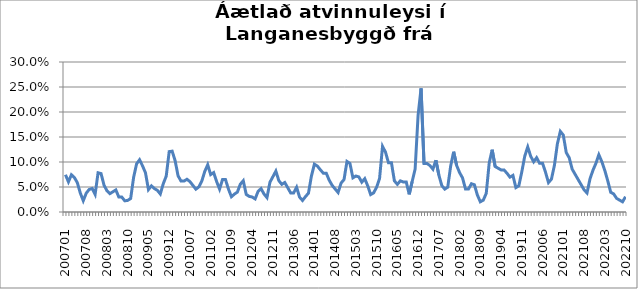
| Category | Series 0 |
|---|---|
| 200701 | 0.074 |
| 200702 | 0.06 |
| 200703 | 0.074 |
| 200704 | 0.069 |
| 200705 | 0.059 |
| 200706 | 0.038 |
| 200707 | 0.023 |
| 200708 | 0.038 |
| 200709 | 0.045 |
| 200710 | 0.047 |
| 200711 | 0.035 |
| 200712 | 0.078 |
| 200801 | 0.077 |
| 200802 | 0.054 |
| 200803 | 0.042 |
| 200804 | 0.037 |
| 200805 | 0.04 |
| 200806 | 0.044 |
| 200807 | 0.03 |
| 200808 | 0.03 |
| 200809 | 0.022 |
| 200810 | 0.023 |
| 200811 | 0.027 |
| 200812 | 0.069 |
| 200901 | 0.096 |
| 200902 | 0.104 |
| 200903 | 0.092 |
| 200904 | 0.078 |
| 200905 | 0.045 |
| 200906 | 0.052 |
| 200907 | 0.047 |
| 200908 | 0.043 |
| 200909 | 0.036 |
| 200910 | 0.057 |
| 200911 | 0.072 |
| 200912 | 0.121 |
| 201001 | 0.122 |
| 201002 | 0.103 |
| 201003 | 0.072 |
| 201004 | 0.062 |
| 201005 | 0.062 |
| 201006 | 0.065 |
| 201007 | 0.061 |
| 201008 | 0.053 |
| 201009 | 0.046 |
| 201010 | 0.05 |
| 201011 | 0.062 |
| 201012 | 0.081 |
| 201101 | 0.094 |
| 201102 | 0.075 |
| 201103 | 0.079 |
| 201104 | 0.061 |
| 201105 | 0.046 |
| 201106 | 0.065 |
| 201107 | 0.065 |
| 201108 | 0.046 |
| 201109 | 0.031 |
| 201110 | 0.036 |
| 201111 | 0.04 |
| 201112 | 0.056 |
| 201201 | 0.062 |
| 201202 | 0.035 |
| 201203 | 0.031 |
| 201204 | 0.03 |
| 201205 | 0.026 |
| 201206 | 0.041 |
| 201207 | 0.047 |
| 201208 | 0.036 |
| 201209 | 0.029 |
| 201210 | 0.059 |
| 201211 | 0.071 |
| 201212 | 0.082 |
| 201301 | 0.063 |
| 201302 | 0.055 |
| 201303 | 0.059 |
| 201304 | 0.049 |
| 201305 | 0.038 |
| 201306 | 0.038 |
| 201307 | 0.05 |
| 201308 | 0.03 |
| 201309 | 0.023 |
| 201310 | 0.031 |
| 201311 | 0.038 |
| 201312 | 0.072 |
| 201401 | 0.096 |
| 201402 | 0.092 |
| 201403 | 0.085 |
| 201404 | 0.078 |
| 201405 | 0.078 |
| 201406 | 0.064 |
| 201407 | 0.053 |
| 201408 | 0.046 |
| 201409 | 0.039 |
| 201410 | 0.058 |
| 201411 | 0.065 |
| 201412 | 0.101 |
| 201501 | 0.097 |
| 201502 | 0.068 |
| 201503 | 0.072 |
| 201504 | 0.07 |
| 201505 | 0.06 |
| 201506 | 0.067 |
| 201507 | 0.052 |
| 201508 | 0.035 |
| 201509 | 0.038 |
| 201510 | 0.05 |
| 201511 | 0.067 |
| 201512 | 0.131 |
| 201601 | 0.12 |
| 201602 | 0.099 |
| 201603 | 0.099 |
| 201604 | 0.062 |
| 201605 | 0.055 |
| 201606 | 0.062 |
| 201607 | 0.06 |
| 201608 | 0.06 |
| 201609 | 0.035 |
| 201610 | 0.061 |
| 201611 | 0.086 |
| 201612 | 0.194 |
| 201701 | 0.247 |
| 201702 | 0.097 |
| 201703 | 0.097 |
| 201704 | 0.093 |
| 201705 | 0.086 |
| 201706 | 0.104 |
| 201707 | 0.074 |
| 201708 | 0.053 |
| 201709 | 0.046 |
| 201710 | 0.05 |
| 201711 | 0.092 |
| 201712 | 0.121 |
| 201801 | 0.093 |
| 201802 | 0.079 |
| 201803 | 0.068 |
| 201804 | 0.046 |
| 201805 | 0.046 |
| 201806 | 0.057 |
| 201807 | 0.054 |
| 201808 | 0.034 |
| 201809 | 0.02 |
| 201810 | 0.024 |
| 201811 | 0.037 |
| 201812 | 0.098 |
| 201901 | 0.125 |
| 201902 | 0.091 |
| 201903 | 0.088 |
| 201904 | 0.084 |
| 201905 | 0.084 |
| 201906 | 0.077 |
| 201907 | 0.07 |
| 201908 | 0.073 |
| 201909 | 0.049 |
| 201910 | 0.052 |
| 201911 | 0.08 |
| 201912 | 0.112 |
| 202001 | 0.13 |
| 202002 | 0.112 |
| 202003 | 0.1 |
| 202004 | 0.109 |
| 202005 | 0.097 |
| 202006 | 0.097 |
| 202007 | 0.08 |
| 202008 | 0.059 |
| 202009 | 0.066 |
| 202010 | 0.093 |
| 202011 | 0.136 |
| 202012 | 0.161 |
| 202101 | 0.154 |
| 202102 | 0.119 |
| 202103 | 0.108 |
| 202104 | 0.086 |
| 202105 | 0.075 |
| 202106 | 0.065 |
| 202107 | 0.055 |
| 202108 | 0.045 |
| 202109 | 0.038 |
| 202110 | 0.066 |
| 202111 | 0.083 |
| 202112 | 0.097 |
| 202201 | 0.115 |
| 202202 | 0.101 |
| 202203 | 0.083 |
| 202204 | 0.062 |
| 202205 | 0.039 |
| 202206 | 0.036 |
| 202207 | 0.027 |
| 202208 | 0.024 |
| 202209 | 0.02 |
| 202210 | 0.031 |